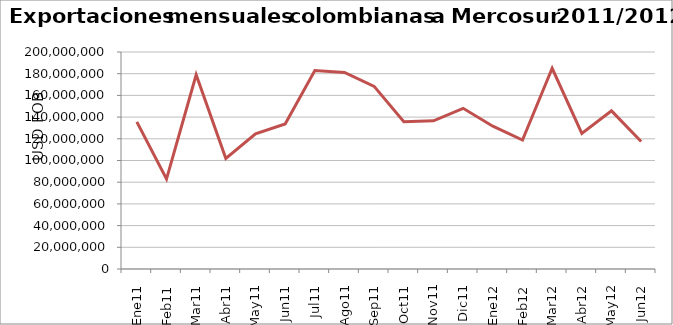
| Category | Series 0 |
|---|---|
| 0 | 135602427.96 |
| 1 | 82895007.69 |
| 2 | 179028720.14 |
| 3 | 101854304.04 |
| 4 | 124539978.25 |
| 5 | 133725417.41 |
| 6 | 182902226.42 |
| 7 | 181156804.06 |
| 8 | 168291372.31 |
| 9 | 135771257.03 |
| 10 | 136589403.71 |
| 11 | 148078295.64 |
| 12 | 131633473.03 |
| 13 | 118881223.16 |
| 14 | 184999783.08 |
| 15 | 125021513.23 |
| 16 | 145755602.45 |
| 17 | 117456787.87 |